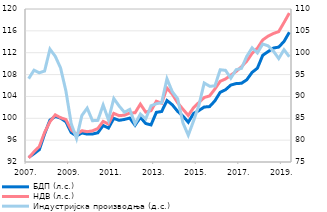
| Category | БДП (л.с.) | НДВ (л.с.) |
|---|---|---|
| 2007. | 92.832 | 92.744 |
| II | 93.521 | 93.866 |
| III | 94.257 | 94.819 |
| IV | 97.157 | 97.429 |
| 2008. | 99.663 | 99.371 |
| II | 100.337 | 100.629 |
| III | 100.028 | 100.098 |
| IV | 99.364 | 99.783 |
| 2009. | 97.387 | 97.87 |
| II | 96.773 | 97.045 |
| III | 97.312 | 97.725 |
| IV | 97.108 | 97.552 |
| 2010. | 97.124 | 97.702 |
| II | 97.347 | 98.131 |
| III | 98.677 | 99.431 |
| IV | 98.217 | 98.944 |
| 2011. | 99.982 | 100.898 |
| II | 99.627 | 100.485 |
| III | 99.788 | 100.568 |
| IV | 100.038 | 100.964 |
| 2012. | 98.726 | 101.005 |
| II | 100.176 | 102.591 |
| III | 99.042 | 101.132 |
| IV | 98.787 | 101.386 |
| 2013. | 101.086 | 103.121 |
| II | 101.241 | 102.762 |
| III | 103.252 | 105.536 |
| IV | 102.468 | 104.401 |
| 2014. | 101.273 | 102.845 |
| II | 100.404 | 101.659 |
| III | 99.274 | 100.528 |
| IV | 100.888 | 101.953 |
| 2015. | 101.416 | 102.889 |
| II | 102.06 | 103.801 |
| III | 102.136 | 104.092 |
| IV | 103.183 | 105.349 |
| 2016. | 104.754 | 106.771 |
| II | 105.218 | 107.195 |
| III | 106.079 | 107.888 |
| IV | 106.354 | 108.566 |
| 2017. | 106.407 | 109.428 |
| II | 107.051 | 110.451 |
| III | 108.4 | 111.893 |
| IV | 109.176 | 112.822 |
| 2018. | 111.531 | 114.338 |
| II | 112.199 | 115.034 |
| III | 112.851 | 115.516 |
| IV | 113.029 | 115.861 |
| 2019. | 114.058 | 117.532 |
| II | 115.746 | 119.256 |